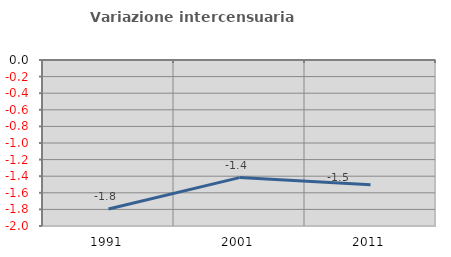
| Category | Variazione intercensuaria annua |
|---|---|
| 1991.0 | -1.796 |
| 2001.0 | -1.417 |
| 2011.0 | -1.504 |